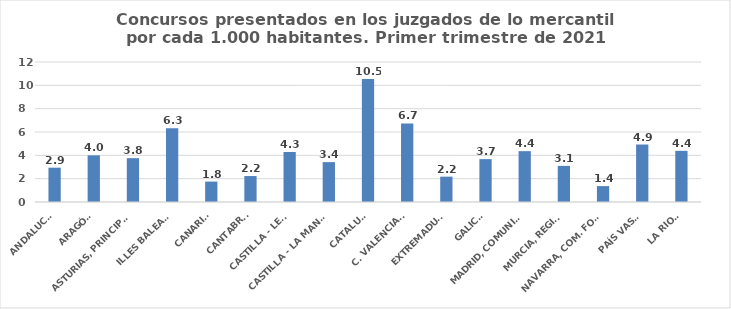
| Category | 616 |
|---|---|
| ANDALUCÍA | 2.942 |
| ARAGÓN | 3.999 |
| ASTURIAS, PRINCIPADO | 3.757 |
| ILLES BALEARS | 6.312 |
| CANARIAS | 1.75 |
| CANTABRIA | 2.225 |
| CASTILLA - LEÓN | 4.283 |
| CASTILLA - LA MANCHA | 3.418 |
| CATALUÑA | 10.533 |
| C. VALENCIANA | 6.733 |
| EXTREMADURA | 2.172 |
| GALICIA | 3.674 |
| MADRID, COMUNIDAD | 4.358 |
| MURCIA, REGIÓN | 3.096 |
| NAVARRA, COM. FORAL | 1.362 |
| PAÍS VASCO | 4.926 |
| LA RIOJA | 4.386 |